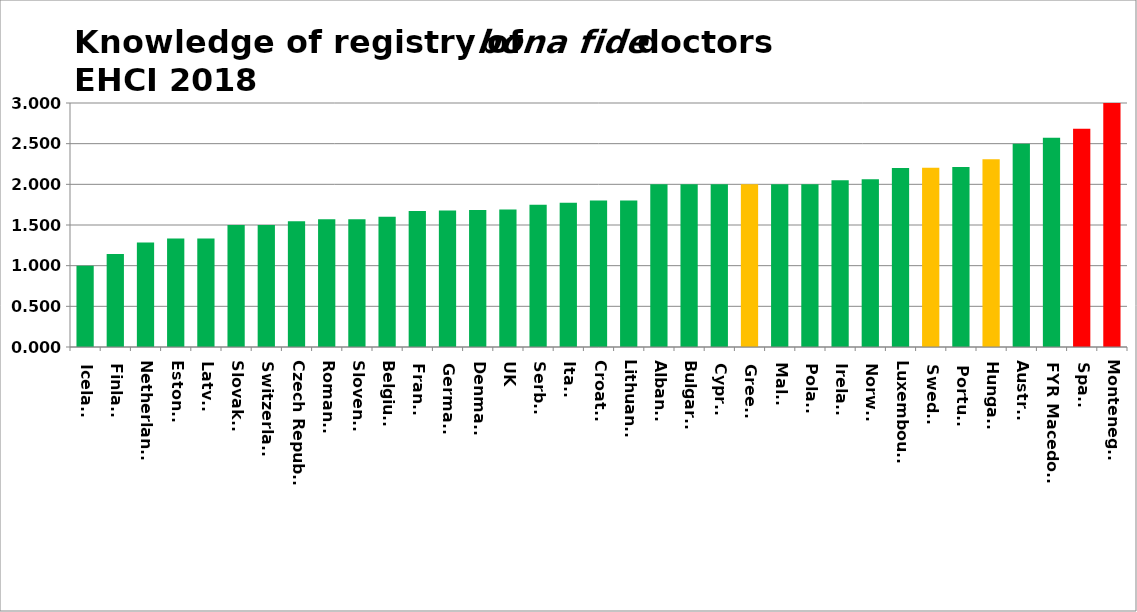
| Category | Series 0 |
|---|---|
| Iceland | 1 |
| Finland | 1.143 |
| Netherlands | 1.286 |
| Estonia | 1.333 |
| Latvia | 1.333 |
| Slovakia | 1.5 |
| Switzerland | 1.5 |
| Czech Republic | 1.545 |
| Romania | 1.571 |
| Slovenia | 1.571 |
| Belgium | 1.6 |
| France | 1.672 |
| Germany | 1.677 |
| Denmark | 1.684 |
| UK | 1.691 |
| Serbia | 1.75 |
| Italy | 1.774 |
| Croatia | 1.8 |
| Lithuania | 1.8 |
| Albania | 2 |
| Bulgaria | 2 |
| Cyprus | 2 |
| Greece | 2 |
| Malta | 2 |
| Poland | 2 |
| Ireland | 2.05 |
| Norway | 2.062 |
| Luxembourg | 2.2 |
| Sweden | 2.205 |
| Portugal | 2.214 |
| Hungary | 2.308 |
| Austria | 2.5 |
| FYR Macedonia | 2.571 |
| Spain | 2.683 |
| Montenegro | 3 |